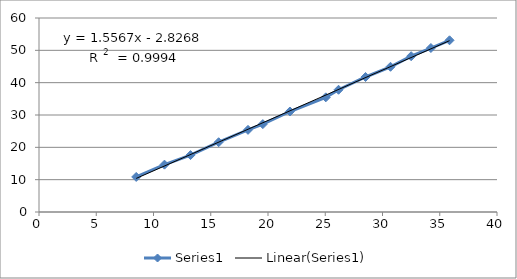
| Category | Series 0 |
|---|---|
| 8.490070671083958 | 10.843 |
| 10.958161342123049 | 14.646 |
| 13.233272459977538 | 17.603 |
| 15.68937857277974 | 21.581 |
| 18.253454467579555 | 25.407 |
| 19.549235279161177 | 27.182 |
| 21.91476671105581 | 31.081 |
| 25.046464820409284 | 35.465 |
| 26.160024847083 | 37.809 |
| 28.519984221594513 | 41.754 |
| 30.6990569887741 | 44.914 |
| 32.503461354138885 | 48.18 |
| 34.22721139678195 | 50.714 |
| 35.85449483677046 | 53.106 |